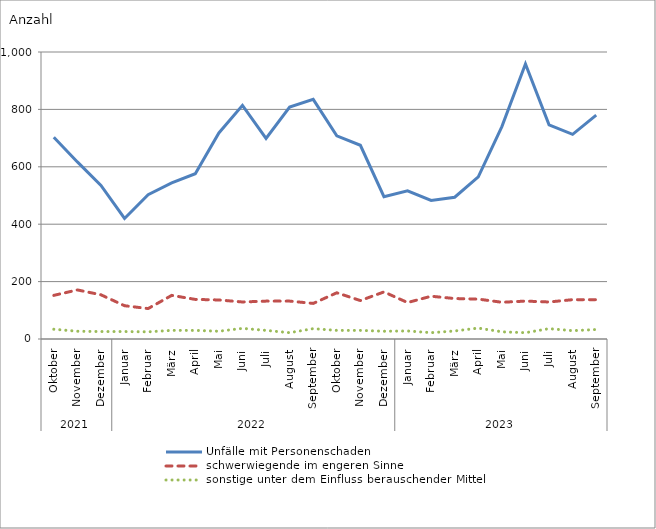
| Category | Unfälle mit Personenschaden | schwerwiegende im engeren Sinne | sonstige unter dem Einfluss berauschender Mittel |
|---|---|---|---|
| 0 | 703 | 152 | 34 |
| 1 | 617 | 171 | 27 |
| 2 | 535 | 154 | 26 |
| 3 | 420 | 116 | 26 |
| 4 | 503 | 106 | 25 |
| 5 | 544 | 152 | 30 |
| 6 | 576 | 138 | 30 |
| 7 | 718 | 136 | 27 |
| 8 | 814 | 129 | 37 |
| 9 | 699 | 132 | 30 |
| 10 | 808 | 132 | 22 |
| 11 | 835 | 124 | 36 |
| 12 | 708 | 161 | 30 |
| 13 | 675 | 134 | 30 |
| 14 | 496 | 164 | 27 |
| 15 | 516 | 127 | 28 |
| 16 | 483 | 149 | 22 |
| 17 | 494 | 141 | 28 |
| 18 | 565 | 139 | 38 |
| 19 | 740 | 128 | 25 |
| 20 | 958 | 132 | 22 |
| 21 | 746 | 129 | 36 |
| 22 | 713 | 137 | 29 |
| 23 | 780 | 137 | 33 |